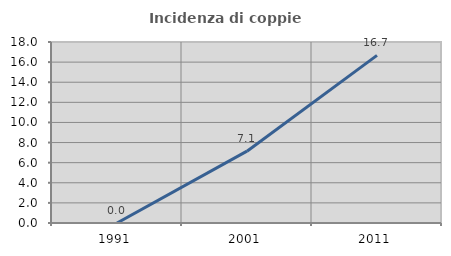
| Category | Incidenza di coppie miste |
|---|---|
| 1991.0 | 0 |
| 2001.0 | 7.143 |
| 2011.0 | 16.667 |